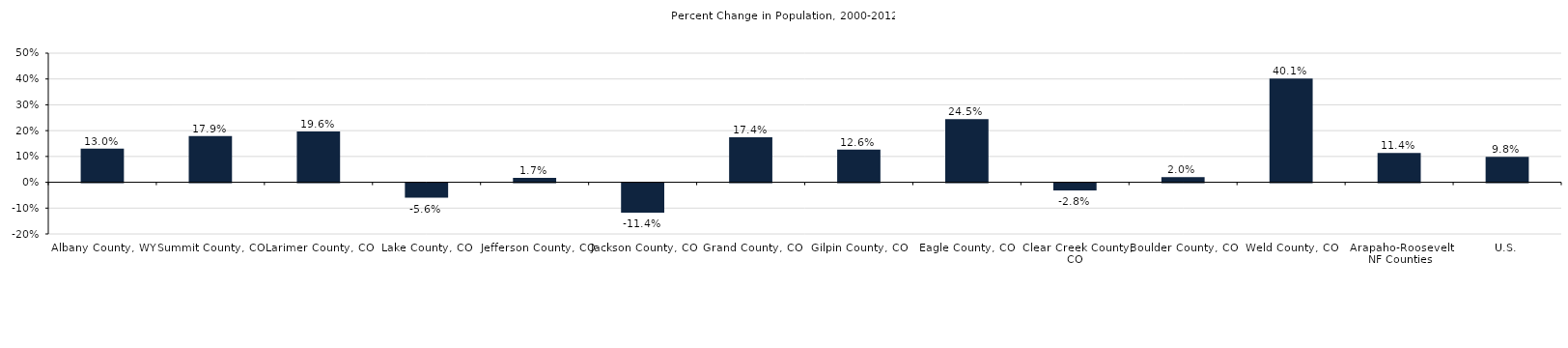
| Category | Population Percent Change (2000-2010*) |
|---|---|
| Gallatin County, MT | 0.332 |
| County Region | 0.276 |
| U.S. | 0.08 |